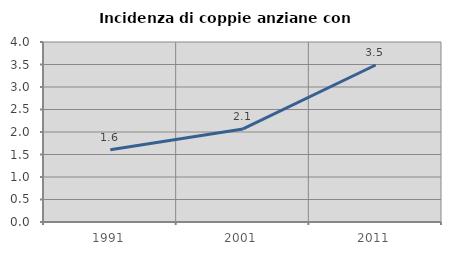
| Category | Incidenza di coppie anziane con figli |
|---|---|
| 1991.0 | 1.607 |
| 2001.0 | 2.069 |
| 2011.0 | 3.488 |